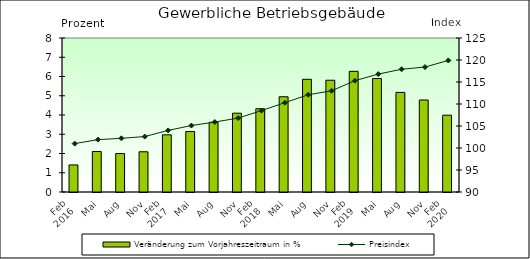
| Category | Veränderung zum Vorjahreszeitraum in % |
|---|---|
| 0 | 1.406 |
| 1 | 2.104 |
| 2 | 1.996 |
| 3 | 2.09 |
| 4 | 2.97 |
| 5 | 3.14 |
| 6 | 3.62 |
| 7 | 4.094 |
| 8 | 4.327 |
| 9 | 4.948 |
| 10 | 5.855 |
| 11 | 5.805 |
| 12 | 6.267 |
| 13 | 5.893 |
| 14 | 5.174 |
| 15 | 4.779 |
| 16 | 3.99 |